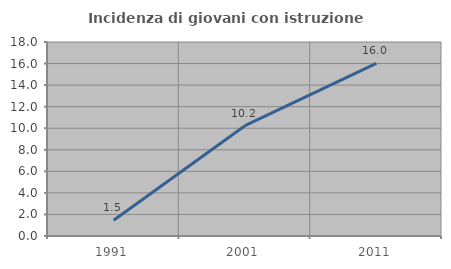
| Category | Incidenza di giovani con istruzione universitaria |
|---|---|
| 1991.0 | 1.46 |
| 2001.0 | 10.233 |
| 2011.0 | 16.026 |